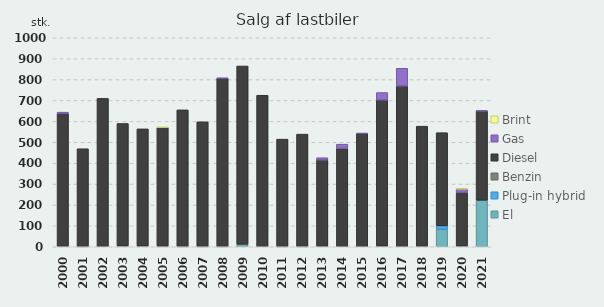
| Category | El | Plug-in hybrid | Benzin | Diesel | Gas | Brint |
|---|---|---|---|---|---|---|
| 2000 | 0 | 0 | 2 | 634 | 8 | 0 |
| 2001 | 0 | 0 | 1 | 468 | 0 | 0 |
| 2002 | 0 | 0 | 0 | 710 | 0 | 0 |
| 2003 | 0 | 0 | 5 | 585 | 0 | 0 |
| 2004 | 0 | 0 | 4 | 560 | 0 | 0 |
| 2005 | 0 | 0 | 2 | 569 | 0 | 1 |
| 2006 | 0 | 0 | 1 | 654 | 0 | 0 |
| 2007 | 0 | 0 | 1 | 597 | 0 | 0 |
| 2008 | 0 | 0 | 1 | 805 | 1 | 0 |
| 2009 | 11 | 0 | 2 | 852 | 0 | 0 |
| 2010 | 0 | 0 | 0 | 725 | 0 | 0 |
| 2011 | 0 | 0 | 1 | 514 | 0 | 0 |
| 2012 | 1 | 0 | 1 | 537 | 0 | 0 |
| 2013 | 2 | 0 | 0 | 413 | 11 | 0 |
| 2014 | 0 | 0 | 0 | 470 | 21 | 0 |
| 2015 | 0 | 0 | 0 | 542 | 1 | 0 |
| 2016 | 3 | 0 | 1 | 698 | 36 | 0 |
| 2017 | 0 | 0 | 0 | 769 | 85 | 0 |
| 2018 | 2 | 0 | 0 | 575 | 0 | 0 |
| 2019 | 83 | 17 | 0 | 446 | 0 | 0 |
| 2020 | 3 | 0 | 0 | 257 | 16 | 3 |
| 2021 | 223 | 0 | 0 | 427 | 1 | 0 |